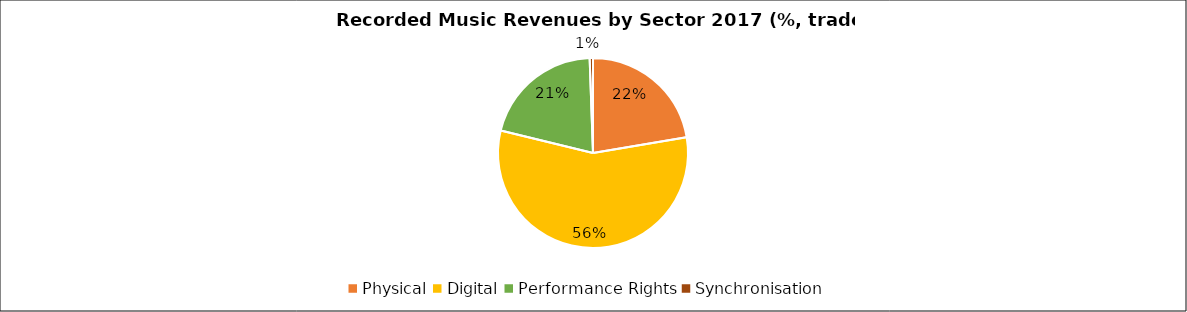
| Category | Series 0 |
|---|---|
| Physical | 13.335 |
| Digital | 33.685 |
| Performance Rights | 12.317 |
| Synchronisation | 0.338 |